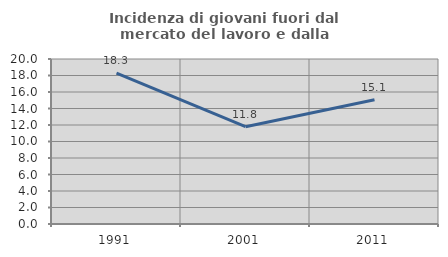
| Category | Incidenza di giovani fuori dal mercato del lavoro e dalla formazione  |
|---|---|
| 1991.0 | 18.284 |
| 2001.0 | 11.792 |
| 2011.0 | 15.068 |